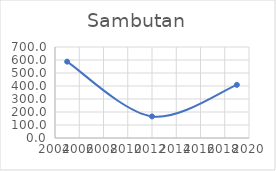
| Category | Series 0 |
|---|---|
| 2005.0 | 587.332 |
| 2012.0 | 166.146 |
| 2019.0 | 408.787 |